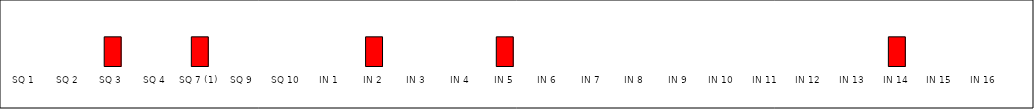
| Category | Series 0 |
|---|---|
| SQ 1 | 0 |
| SQ 2 | 0 |
| SQ 3 | 1 |
| SQ 4 | 0 |
| SQ 7 (1) | 1 |
| SQ 9 | 0 |
| SQ 10 | 0 |
| IN 1 | 0 |
| IN 2 | 1 |
| IN 3 | 0 |
| IN 4 | 0 |
| IN 5 | 1 |
| IN 6 | 0 |
| IN 7 | 0 |
| IN 8 | 0 |
| IN 9 | 0 |
| IN 10 | 0 |
| IN 11 | 0 |
| IN 12 | 0 |
| IN 13 | 0 |
| IN 14 | 1 |
| IN 15 | 0 |
| IN 16 | 0 |